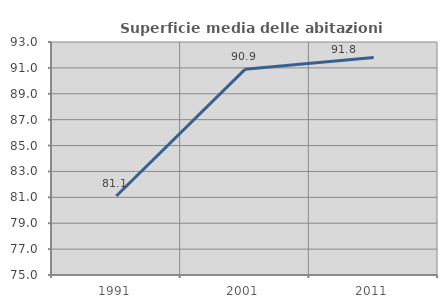
| Category | Superficie media delle abitazioni occupate |
|---|---|
| 1991.0 | 81.104 |
| 2001.0 | 90.889 |
| 2011.0 | 91.8 |